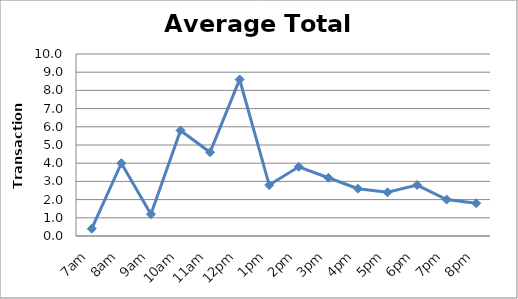
| Category | Series 0 |
|---|---|
| 7am | 0.4 |
| 8am | 4 |
| 9am | 1.2 |
| 10am | 5.8 |
| 11am | 4.6 |
| 12pm | 8.6 |
| 1pm | 2.8 |
| 2pm | 3.8 |
| 3pm | 3.2 |
| 4pm | 2.6 |
| 5pm | 2.4 |
| 6pm | 2.8 |
| 7pm | 2 |
| 8pm | 1.8 |